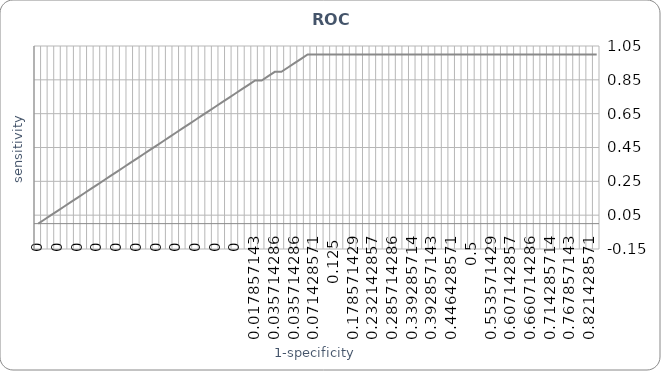
| Category | Series 0 |
|---|---|
| 0.0 | 0 |
| 0.0 | 0.026 |
| 0.0 | 0.051 |
| 0.0 | 0.077 |
| 0.0 | 0.103 |
| 0.0 | 0.128 |
| 0.0 | 0.154 |
| 0.0 | 0.179 |
| 0.0 | 0.205 |
| 0.0 | 0.231 |
| 0.0 | 0.256 |
| 0.0 | 0.282 |
| 0.0 | 0.308 |
| 0.0 | 0.333 |
| 0.0 | 0.359 |
| 0.0 | 0.385 |
| 0.0 | 0.41 |
| 0.0 | 0.436 |
| 0.0 | 0.462 |
| 0.0 | 0.487 |
| 0.0 | 0.513 |
| 0.0 | 0.538 |
| 0.0 | 0.564 |
| 0.0 | 0.59 |
| 0.0 | 0.615 |
| 0.0 | 0.641 |
| 0.0 | 0.667 |
| 0.0 | 0.692 |
| 0.0 | 0.718 |
| 0.0 | 0.744 |
| 0.0 | 0.769 |
| 0.0 | 0.795 |
| 0.0 | 0.821 |
| 0.017857142857142905 | 0.846 |
| 0.017857142857142905 | 0.846 |
| 0.017857142857142905 | 0.872 |
| 0.0357142857142857 | 0.897 |
| 0.0357142857142857 | 0.897 |
| 0.0357142857142857 | 0.923 |
| 0.0357142857142857 | 0.949 |
| 0.0357142857142857 | 0.974 |
| 0.0535714285714286 | 1 |
| 0.0714285714285714 | 1 |
| 0.0892857142857143 | 1 |
| 0.1071428571428571 | 1 |
| 0.125 | 1 |
| 0.1428571428571429 | 1 |
| 0.1607142857142857 | 1 |
| 0.1785714285714286 | 1 |
| 0.1964285714285714 | 1 |
| 0.2142857142857143 | 1 |
| 0.2321428571428571 | 1 |
| 0.25 | 1 |
| 0.2678571428571429 | 1 |
| 0.2857142857142857 | 1 |
| 0.3035714285714286 | 1 |
| 0.3214285714285714 | 1 |
| 0.3392857142857143 | 1 |
| 0.3571428571428571 | 1 |
| 0.375 | 1 |
| 0.3928571428571429 | 1 |
| 0.4107142857142857 | 1 |
| 0.4285714285714286 | 1 |
| 0.4464285714285714 | 1 |
| 0.4642857142857143 | 1 |
| 0.4821428571428571 | 1 |
| 0.5 | 1 |
| 0.5178571428571428 | 1 |
| 0.5357142857142857 | 1 |
| 0.5535714285714286 | 1 |
| 0.5714285714285714 | 1 |
| 0.5892857142857143 | 1 |
| 0.6071428571428572 | 1 |
| 0.625 | 1 |
| 0.6428571428571428 | 1 |
| 0.6607142857142857 | 1 |
| 0.6785714285714286 | 1 |
| 0.6964285714285714 | 1 |
| 0.7142857142857143 | 1 |
| 0.7321428571428572 | 1 |
| 0.75 | 1 |
| 0.7678571428571428 | 1 |
| 0.7857142857142857 | 1 |
| 0.8035714285714286 | 1 |
| 0.8214285714285714 | 1 |
| 0.8392857142857143 | 1 |